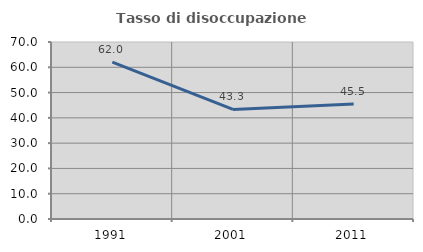
| Category | Tasso di disoccupazione giovanile  |
|---|---|
| 1991.0 | 62.025 |
| 2001.0 | 43.333 |
| 2011.0 | 45.455 |